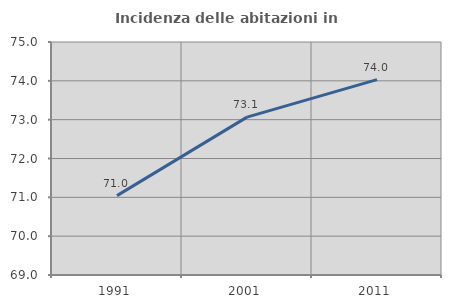
| Category | Incidenza delle abitazioni in proprietà  |
|---|---|
| 1991.0 | 71.044 |
| 2001.0 | 73.065 |
| 2011.0 | 74.03 |